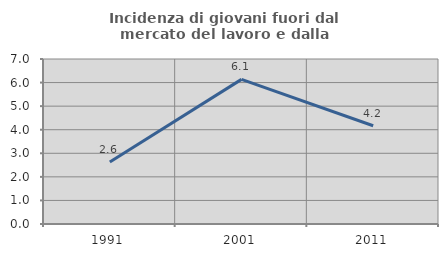
| Category | Incidenza di giovani fuori dal mercato del lavoro e dalla formazione  |
|---|---|
| 1991.0 | 2.632 |
| 2001.0 | 6.135 |
| 2011.0 | 4.167 |